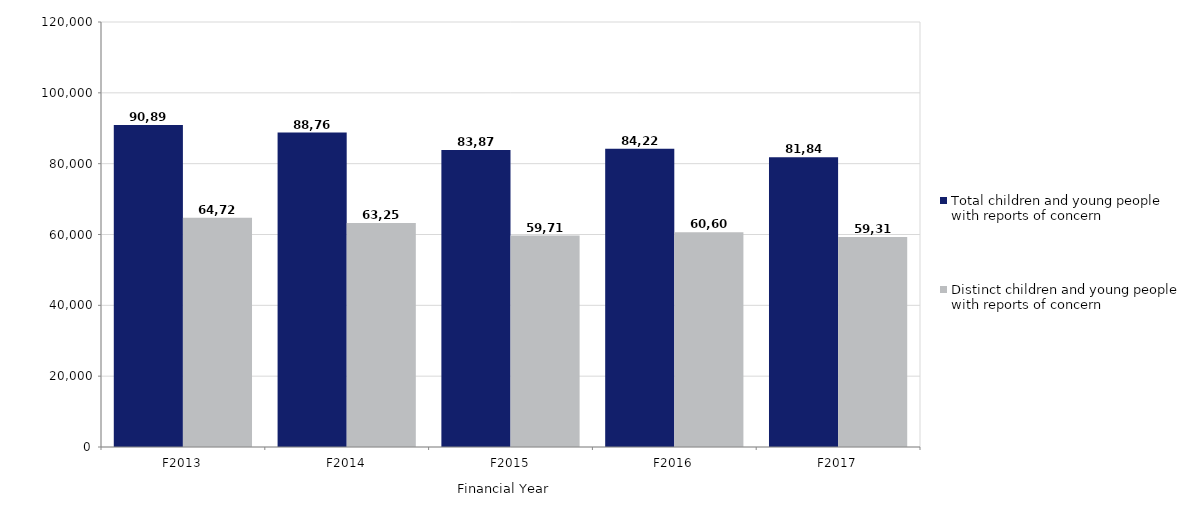
| Category | Total children and young people with reports of concern | Distinct children and young people with reports of concern |
|---|---|---|
| F2013 | 90893 | 64726 |
| F2014 | 88768 | 63250 |
| F2015 | 83871 | 59713 |
| F2016 | 84228 | 60605 |
| F2017 | 81840 | 59317 |